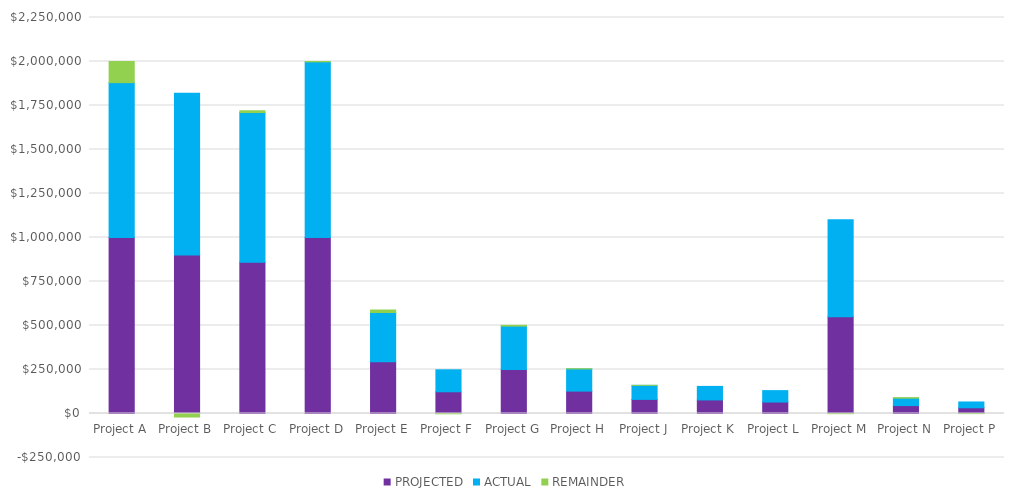
| Category | PROJECTED | ACTUAL | REMAINDER |
|---|---|---|---|
| Project A | 1000000 | 880000 | 120000 |
| Project B | 900000 | 920000 | -20000 |
| Project C | 860000 | 850000 | 10000 |
| Project D | 1000000 | 998050 | 1950 |
| Project E | 294000 | 280000 | 14000 |
| Project F | 123400 | 125000 | -1600 |
| Project G | 250500 | 246000 | 4500 |
| Project H | 127200 | 126000 | 1200 |
| Project J | 80000 | 79900 | 100 |
| Project K | 77000 | 77000 | 0 |
| Project L | 65000 | 65000 | 0 |
| Project M | 550000 | 551000 | -1000 |
| Project N | 45000 | 42000 | 3000 |
| Project P | 32500 | 33000 | -500 |